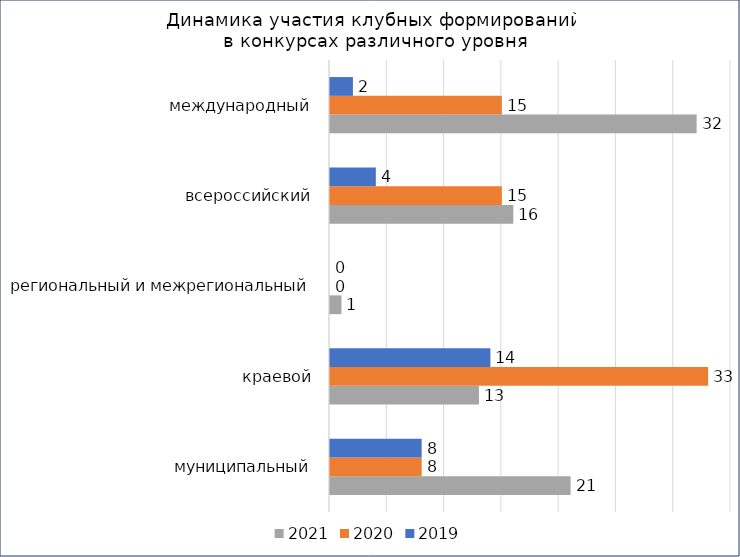
| Category | 2021 | 2020 | 2019 |
|---|---|---|---|
| муниципальный | 21 | 8 | 8 |
| краевой | 13 | 33 | 14 |
| региональный и межрегиональный | 1 | 0 | 0 |
| всероссийский | 16 | 15 | 4 |
| международный | 32 | 15 | 2 |